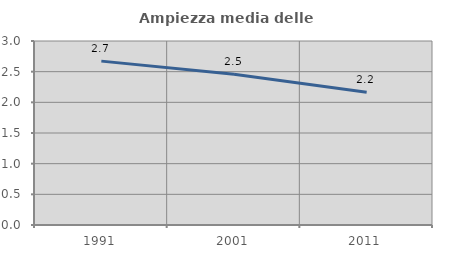
| Category | Ampiezza media delle famiglie |
|---|---|
| 1991.0 | 2.672 |
| 2001.0 | 2.458 |
| 2011.0 | 2.163 |